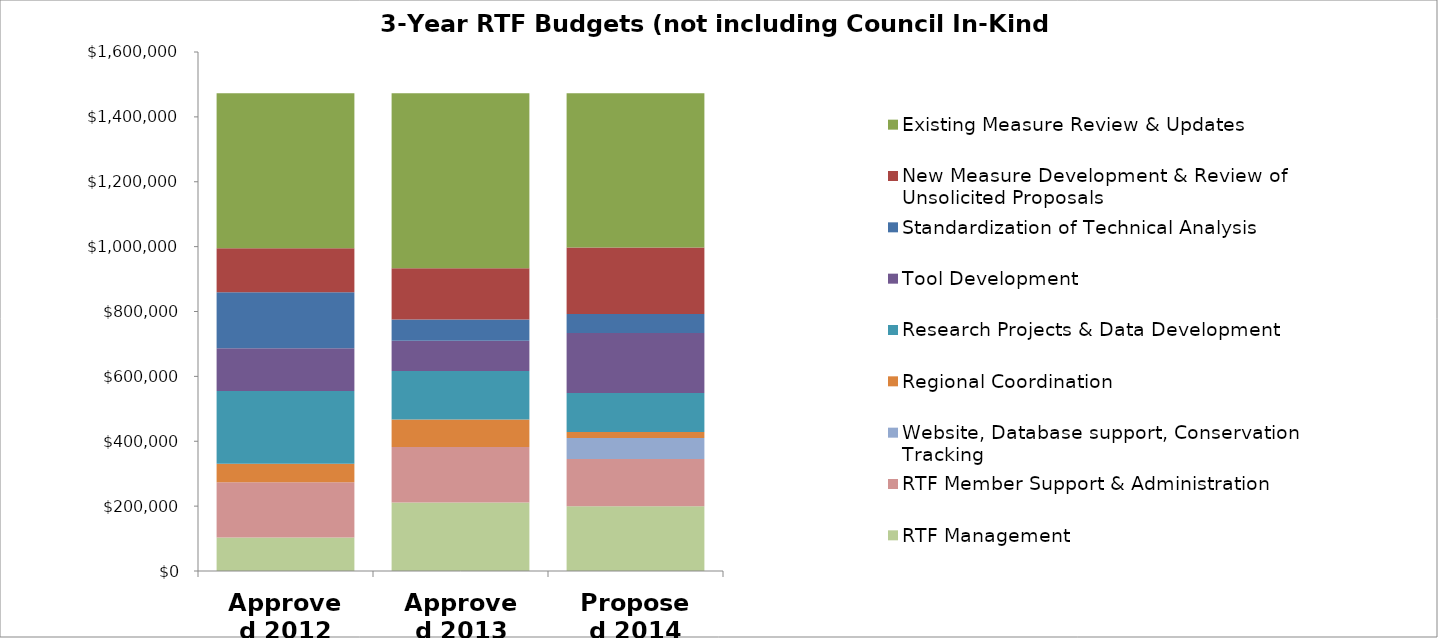
| Category | RTF Management | RTF Member Support & Administration | Website, Database support, Conservation Tracking  | Regional Coordination | Research Projects & Data Development | Tool Development | Standardization of Technical Analysis | New Measure Development & Review of Unsolicited Proposals | Existing Measure Review & Updates |
|---|---|---|---|---|---|---|---|---|---|
| Approved 2012 | 103110 | 170868 | 0 | 56956 | 223896 | 131588 | 172832 | 135516 | 478234 |
| Approved 2013 | 211130 | 170868 | 0 | 85434 | 149165.8 | 93290 | 65303 | 158102 | 539707.2 |
| Proposed 2014 | 200000 | 145000 | 65000 | 18500 | 120000 | 185000 | 59000 | 205000 | 475500 |